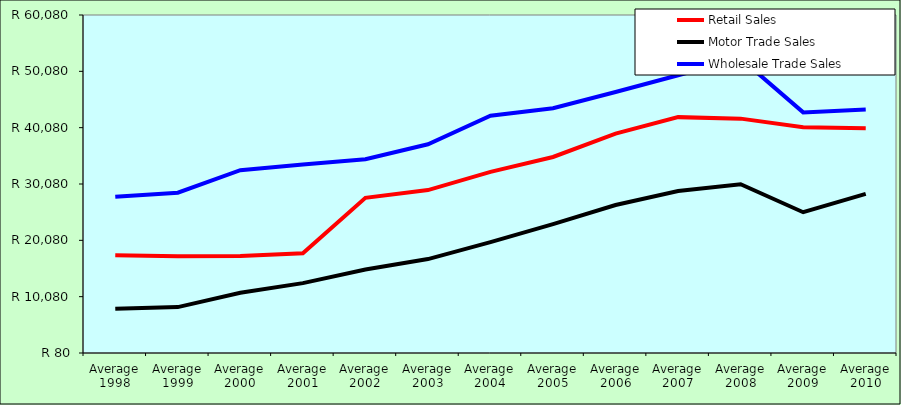
| Category | Retail Sales  | Motor Trade Sales | Wholesale Trade Sales |
|---|---|---|---|
| Average 1998 | 17425.5 | 7921 | 27807.333 |
| Average 1999 | 17237.583 | 8232 | 28532.333 |
| Average 2000 | 17300.667 | 10762.917 | 32527.5 |
| Average 2001 | 17772.833 | 12482.167 | 33522.417 |
| Average 2002 | 27629.667 | 14908.167 | 34464.917 |
| Average 2003 | 28996.167 | 16750.333 | 37136.333 |
| Average 2004 | 32240.417 | 19767.75 | 42187.083 |
| Average 2005 | 34879.667 | 22950.75 | 43532.5 |
| Average 2006 | 39037.167 | 26349.667 | 46409.25 |
| Average 2007 | 41950.455 | 28832.273 | 49383.455 |
| Average 2008 | 41682.583 | 30045.167 | 52379.25 |
| Average 2009 | 40159 | 25070.417 | 42793 |
| Average 2010 | 39983.857 | 28326.714 | 43316.714 |